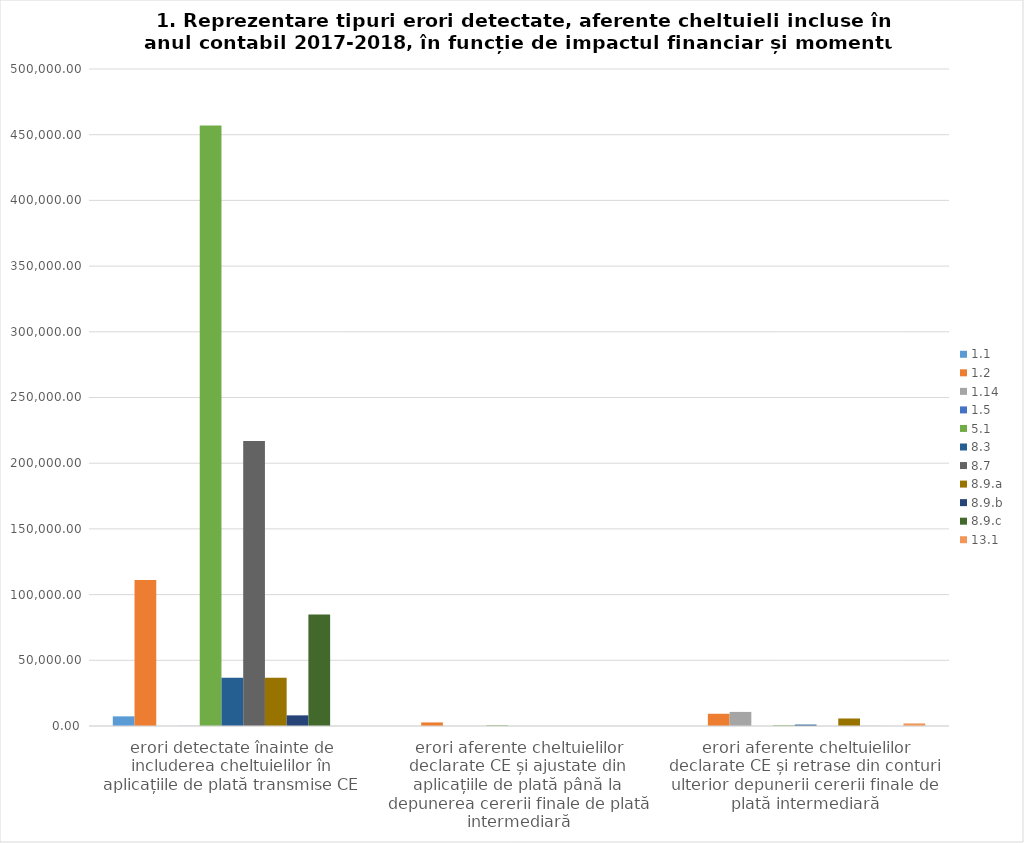
| Category | 1.1 | 1.2 | 1.14 | 1.5 | 5.1 | 8.3 | 8.7 | 8.9.a  | 8.9.b | 8.9.c  | 13.1 |
|---|---|---|---|---|---|---|---|---|---|---|---|
| erori detectate înainte de includerea cheltuielilor în aplicațiile de plată transmise CE | 7343.137 | 111098.019 | 0 | 90.093 | 457087.142 | 36746.289 | 216980.547 | 36763.896 | 8100.574 | 84878.415 | 0 |
| erori aferente cheltuielilor declarate CE și ajustate din aplicațiile de plată până la depunerea cererii finale de plată intermediară | 0 | 2724.12 | 0 | 0 | 509.65 | 0 | 0 | 0 | 0 | 0 | 0 |
| erori aferente cheltuielilor declarate CE și retrase din conturi ulterior depunerii cererii finale de plată intermediară | 0 | 9313.8 | 10715.47 | 0 | 531.78 | 1078.89 | 0 | 5721.13 | 43.55 | 0 | 1974.55 |